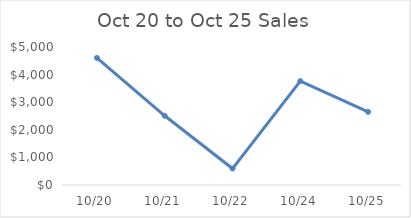
| Category | Total |
|---|---|
| 10/20 | 4606 |
| 10/21 | 2508 |
| 10/22 | 596 |
| 10/24 | 3765 |
| 10/25 | 2648 |